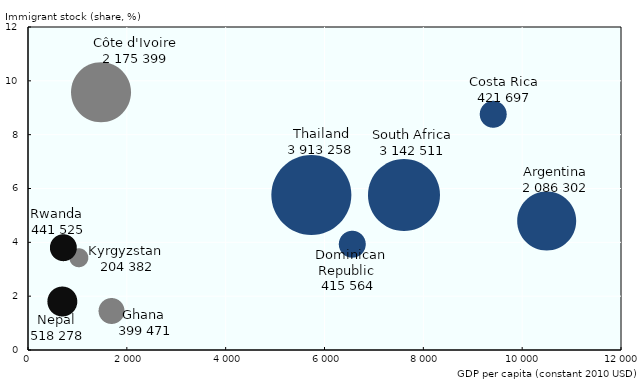
| Category | Series 0 |
|---|---|
| 10490.019568323509 | 4.805 |
| 9406.75679135512 | 8.771 |
| 1474.058169445497 | 9.583 |
| 6552.69251271167 | 3.947 |
| 1685.9861214400507 | 1.457 |
| 1021.1607926137517 | 3.441 |
| 686.0835484238803 | 1.818 |
| 714.5431748243136 | 3.803 |
| 7605.3953671587105 | 5.767 |
| 5733.9214472681715 | 5.758 |